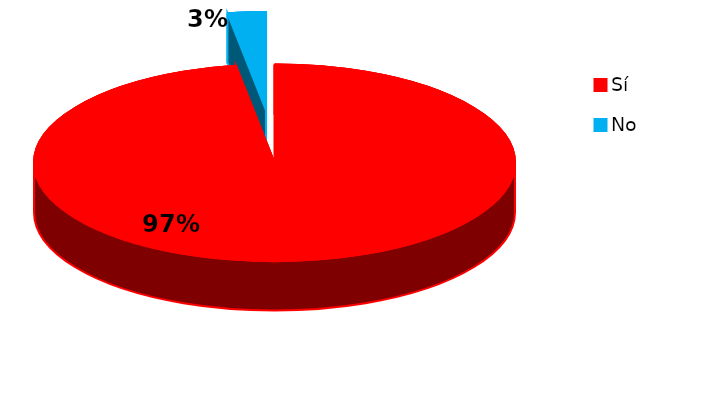
| Category | Series 0 |
|---|---|
| 0 | 38 |
| 1 | 1 |